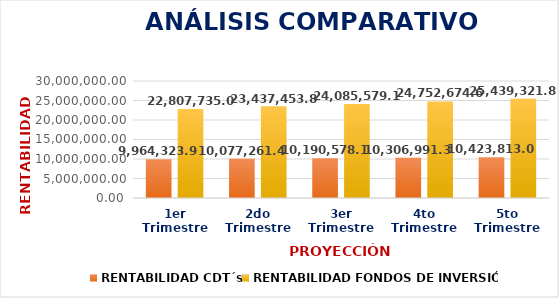
| Category | RENTABILIDAD CDT´s | RENTABILIDAD FONDOS DE INVERSIÓN |
|---|---|---|
| 1er Trimestre | 9964323.957 | 22807735.031 |
| 2do Trimestre | 10077261.404 | 23437453.862 |
| 3er Trimestre | 10190578.108 | 24085579.162 |
| 4to Trimestre  | 10306991.369 | 24752674.62 |
| 5to Trimestre | 10423813.077 | 25439321.798 |